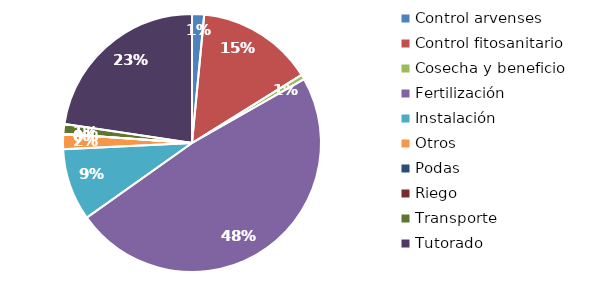
| Category | Valor |
|---|---|
| Control arvenses | 80000 |
| Control fitosanitario | 775500 |
| Cosecha y beneficio | 32500 |
| Fertilización | 2565000 |
| Instalación | 480000 |
| Otros | 100000 |
| Podas | 0 |
| Riego | 0 |
| Transporte | 65000 |
| Tutorado | 1200000 |